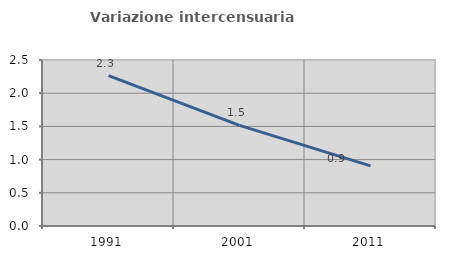
| Category | Variazione intercensuaria annua |
|---|---|
| 1991.0 | 2.263 |
| 2001.0 | 1.516 |
| 2011.0 | 0.905 |